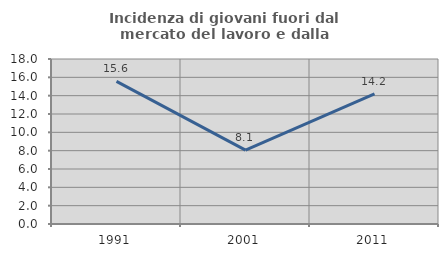
| Category | Incidenza di giovani fuori dal mercato del lavoro e dalla formazione  |
|---|---|
| 1991.0 | 15.556 |
| 2001.0 | 8.054 |
| 2011.0 | 14.189 |